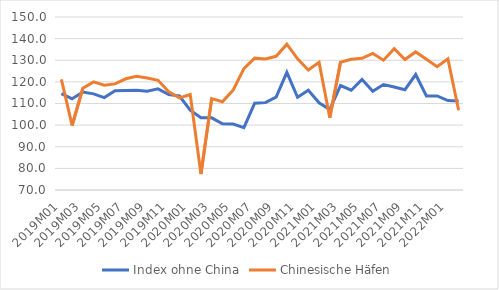
| Category | Index ohne China | Chinesische Häfen |
|---|---|---|
| 2019M01 | 114.583 | 121.197 |
| 2019M02 | 112.133 | 99.845 |
| 2019M03 | 115.276 | 117.068 |
| 2019M04 | 114.469 | 119.996 |
| 2019M05 | 112.741 | 118.466 |
| 2019M06 | 115.876 | 119.073 |
| 2019M07 | 116.023 | 121.426 |
| 2019M08 | 116.126 | 122.609 |
| 2019M09 | 115.666 | 121.75 |
| 2019M10 | 116.763 | 120.734 |
| 2019M11 | 114.102 | 115.382 |
| 2019M12 | 113.478 | 112.617 |
| 2020M01 | 106.928 | 114.139 |
| 2020M02 | 103.38 | 77.361 |
| 2020M03 | 103.376 | 112.253 |
| 2020M04 | 100.617 | 110.831 |
| 2020M05 | 100.492 | 116.212 |
| 2020M06 | 98.817 | 126.111 |
| 2020M07 | 110.106 | 130.977 |
| 2020M08 | 110.402 | 130.62 |
| 2020M09 | 112.937 | 131.833 |
| 2020M10 | 124.432 | 137.42 |
| 2020M11 | 112.868 | 130.64 |
| 2020M12 | 116.088 | 125.522 |
| 2021M01 | 110.339 | 129.059 |
| 2021M02 | 107.171 | 103.467 |
| 2021M03 | 118.318 | 129.106 |
| 2021M04 | 116.157 | 130.474 |
| 2021M05 | 121.162 | 130.899 |
| 2021M06 | 115.608 | 133.123 |
| 2021M07 | 118.74 | 130.039 |
| 2021M08 | 117.641 | 135.309 |
| 2021M09 | 116.382 | 130.312 |
| 2021M10 | 123.397 | 133.857 |
| 2021M11 | 113.496 | 130.506 |
| 2021M12 | 113.504 | 127.051 |
| 2022M01 | 111.365 | 130.633 |
| 2022M02 | 111.13 | 106.853 |